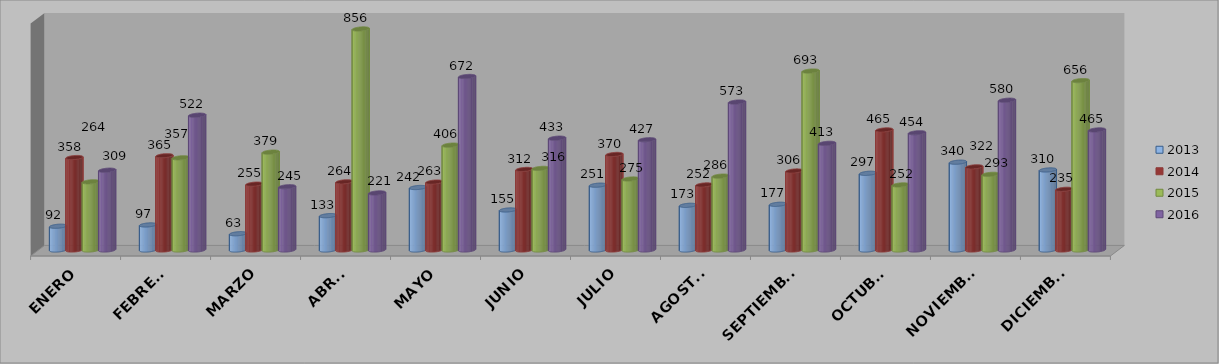
| Category | 2013 | 2014 | 2015 | 2016 |
|---|---|---|---|---|
| ENERO | 92 | 358 | 264 | 309 |
| FEBRERO | 97 | 365 | 357 | 522 |
| MARZO | 63 | 255 | 379 | 245 |
| ABRIL | 133 | 264 | 856 | 221 |
| MAYO | 242 | 263 | 406 | 672 |
| JUNIO | 155 | 312 | 316 | 433 |
| JULIO | 251 | 370 | 275 | 427 |
| AGOSTO | 173 | 252 | 286 | 573 |
| SEPTIEMBRE | 177 | 306 | 693 | 413 |
| OCTUBRE | 297 | 465 | 252 | 454 |
| NOVIEMBRE | 340 | 322 | 293 | 580 |
| DICIEMBRE | 310 | 235 | 656 | 465 |